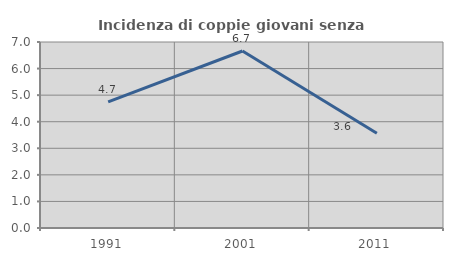
| Category | Incidenza di coppie giovani senza figli |
|---|---|
| 1991.0 | 4.743 |
| 2001.0 | 6.662 |
| 2011.0 | 3.562 |